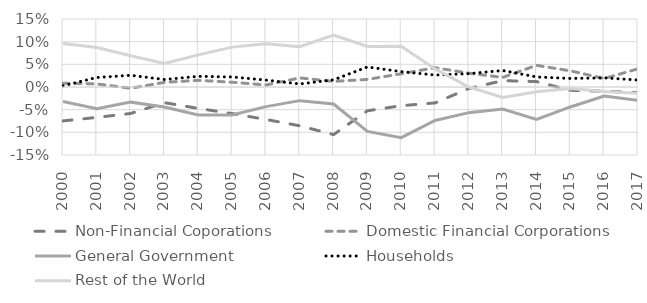
| Category | Non-Financial Coporations | Domestic Financial Corporations | General Government | Households | Rest of the World |
|---|---|---|---|---|---|
| 2000 | -0.075 | 0.008 | -0.032 | 0.003 | 0.096 |
| 2001 | -0.067 | 0.007 | -0.048 | 0.021 | 0.087 |
| 2002 | -0.058 | -0.003 | -0.033 | 0.026 | 0.069 |
| 2003 | -0.035 | 0.01 | -0.044 | 0.017 | 0.052 |
| 2004 | -0.047 | 0.015 | -0.062 | 0.024 | 0.071 |
| 2005 | -0.059 | 0.011 | -0.062 | 0.022 | 0.088 |
| 2006 | -0.072 | 0.004 | -0.043 | 0.015 | 0.095 |
| 2007 | -0.086 | 0.02 | -0.03 | 0.007 | 0.089 |
| 2008 | -0.105 | 0.012 | -0.038 | 0.016 | 0.114 |
| 2009 | -0.052 | 0.017 | -0.098 | 0.044 | 0.09 |
| 2010 | -0.041 | 0.029 | -0.112 | 0.034 | 0.09 |
| 2011 | -0.035 | 0.043 | -0.074 | 0.026 | 0.04 |
| 2012 | -0.003 | 0.031 | -0.057 | 0.029 | 0 |
| 2013 | 0.014 | 0.021 | -0.048 | 0.036 | -0.023 |
| 2014 | 0.012 | 0.048 | -0.072 | 0.022 | -0.01 |
| 2015 | -0.007 | 0.036 | -0.044 | 0.019 | -0.003 |
| 2016 | -0.009 | 0.019 | -0.02 | 0.02 | -0.01 |
| 2017 | -0.012 | 0.04 | -0.03 | 0.015 | -0.014 |